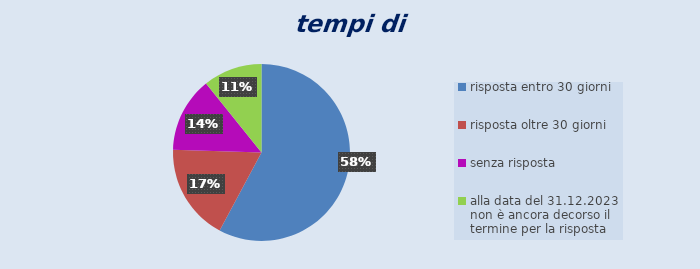
| Category | Series 0 |
|---|---|
| risposta entro 30 giorni | 59 |
| risposta oltre 30 giorni | 18 |
| senza risposta | 14 |
| alla data del 31.12.2023 non è ancora decorso il termine per la risposta | 11 |